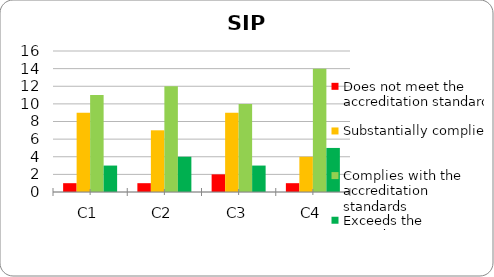
| Category | Does not meet the accreditation standard | Substantially complies | Complies with the accreditation standards | Exceeds the accreditation standards |
|---|---|---|---|---|
| C1 | 1 | 9 | 11 | 3 |
| C2 | 1 | 7 | 12 | 4 |
| C3 | 2 | 9 | 10 | 3 |
| C4 | 1 | 4 | 14 | 5 |